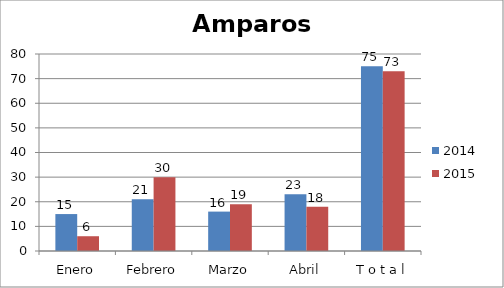
| Category | 2014 | 2015 |
|---|---|---|
| Enero | 15 | 6 |
| Febrero | 21 | 30 |
| Marzo | 16 | 19 |
| Abril | 23 | 18 |
| T o t a l | 75 | 73 |